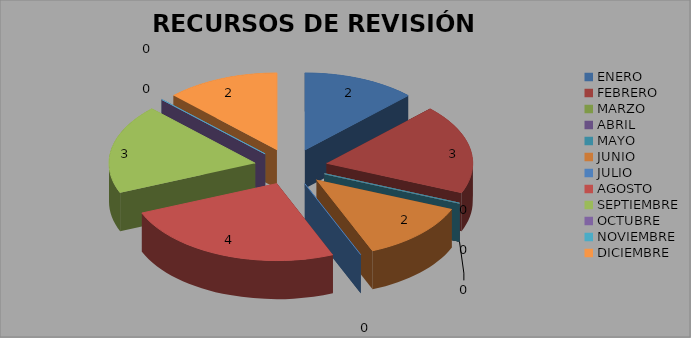
| Category | RECURSOS DE REVISIÓN |
|---|---|
| ENERO | 2 |
| FEBRERO | 3 |
| MARZO | 0 |
| ABRIL | 0 |
| MAYO | 0 |
| JUNIO | 2 |
| JULIO | 0 |
| AGOSTO | 4 |
| SEPTIEMBRE | 3 |
| OCTUBRE | 0 |
| NOVIEMBRE | 0 |
| DICIEMBRE | 2 |